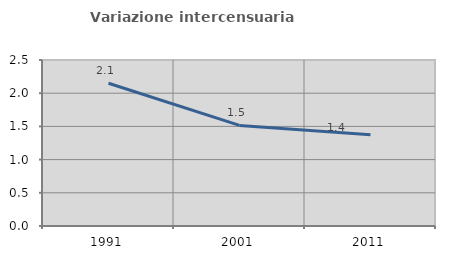
| Category | Variazione intercensuaria annua |
|---|---|
| 1991.0 | 2.15 |
| 2001.0 | 1.514 |
| 2011.0 | 1.373 |